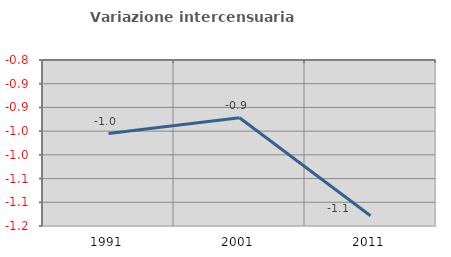
| Category | Variazione intercensuaria annua |
|---|---|
| 1991.0 | -0.955 |
| 2001.0 | -0.922 |
| 2011.0 | -1.128 |